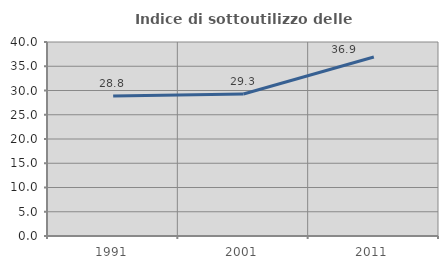
| Category | Indice di sottoutilizzo delle abitazioni  |
|---|---|
| 1991.0 | 28.846 |
| 2001.0 | 29.278 |
| 2011.0 | 36.915 |